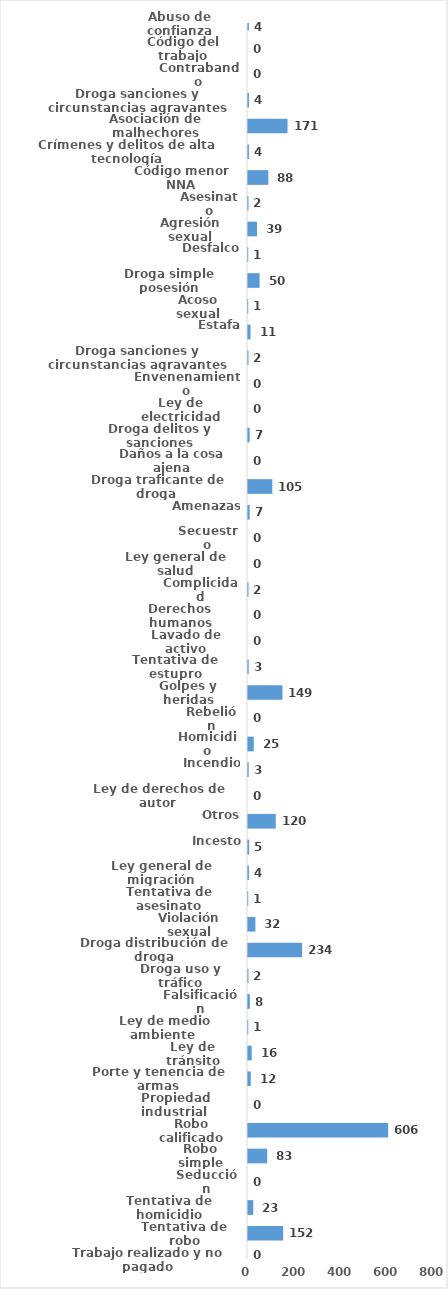
| Category | Series 0 |
|---|---|
| Abuso de confianza | 4 |
| Código del trabajo | 0 |
| Contrabando | 0 |
| Droga sanciones y circunstancias agravantes | 4 |
| Asociación de malhechores | 171 |
| Crímenes y delitos de alta tecnología | 4 |
| Código menor NNA | 88 |
| Asesinato | 2 |
| Agresión sexual | 39 |
| Desfalco | 1 |
| Droga simple posesión | 50 |
| Acoso sexual | 1 |
| Estafa | 11 |
| Droga sanciones y circunstancias agravantes | 2 |
| Envenenamiento | 0 |
| Ley de electricidad | 0 |
| Droga delitos y sanciones | 7 |
| Daños a la cosa ajena | 0 |
| Droga traficante de droga  | 105 |
| Amenazas | 7 |
| Secuestro | 0 |
| Ley general de salud | 0 |
| Complicidad | 2 |
| Derechos humanos | 0 |
| Lavado de activo | 0 |
| Tentativa de estupro | 3 |
| Golpes y heridas | 149 |
| Rebelión | 0 |
| Homicidio | 25 |
| Incendio | 3 |
| Ley de derechos de autor  | 0 |
| Otros | 120 |
| Incesto | 5 |
| Ley general de migración | 4 |
| Tentativa de asesinato | 1 |
| Violación sexual | 32 |
| Droga distribución de droga | 234 |
| Droga uso y tráfico | 2 |
| Falsificación | 8 |
| Ley de medio ambiente  | 1 |
| Ley de tránsito | 16 |
| Porte y tenencia de armas | 12 |
| Propiedad industrial  | 0 |
| Robo calificado | 606 |
| Robo simple | 83 |
| Seducción | 0 |
| Tentativa de homicidio | 23 |
| Tentativa de robo | 152 |
| Trabajo realizado y no pagado | 0 |